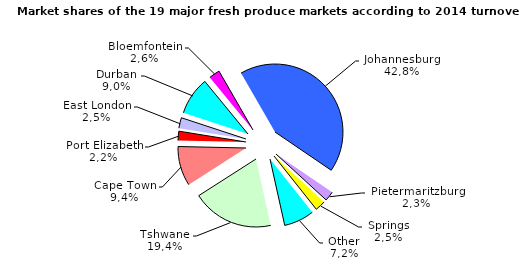
| Category | Series 1 |
|---|---|
| Johannesburg | 0.428 |
| Pietermaritzburg | 0.023 |
| Springs | 0.025 |
| Other | 0.072 |
| Tshwane | 0.194 |
| Cape Town | 0.094 |
| Port Elizabeth | 0.022 |
| East London | 0.025 |
| Durban | 0.09 |
| Bloemfontein | 0.026 |